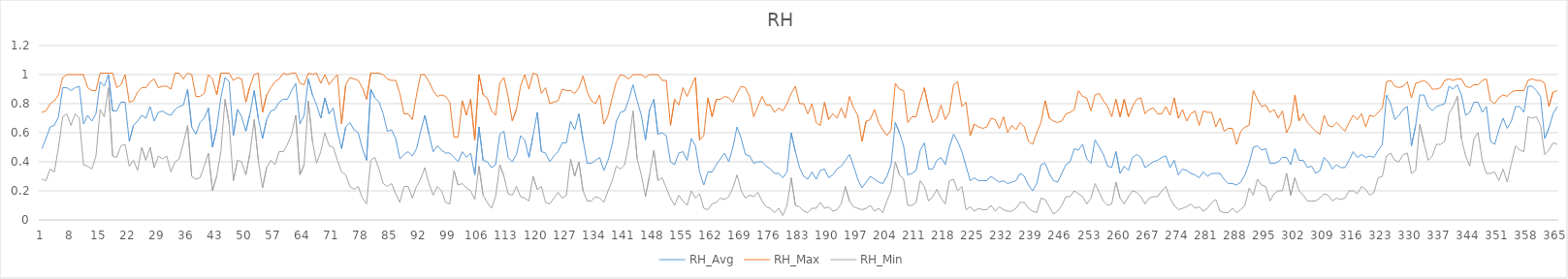
| Category | RH_Avg | RH_Max | RH_Min |
|---|---|---|---|
| 0 | 0.49 | 0.74 | 0.28 |
| 1 | 0.56 | 0.75 | 0.27 |
| 2 | 0.64 | 0.8 | 0.35 |
| 3 | 0.65 | 0.82 | 0.33 |
| 4 | 0.71 | 0.86 | 0.5 |
| 5 | 0.91 | 0.98 | 0.71 |
| 6 | 0.91 | 1 | 0.73 |
| 7 | 0.89 | 1 | 0.65 |
| 8 | 0.91 | 1 | 0.73 |
| 9 | 0.92 | 1 | 0.7 |
| 10 | 0.66 | 1 | 0.38 |
| 11 | 0.72 | 0.91 | 0.37 |
| 12 | 0.68 | 0.89 | 0.35 |
| 13 | 0.73 | 0.89 | 0.44 |
| 14 | 0.95 | 1.01 | 0.76 |
| 15 | 0.92 | 1.01 | 0.71 |
| 16 | 1 | 1.01 | 0.91 |
| 17 | 0.75 | 1.01 | 0.44 |
| 18 | 0.75 | 0.91 | 0.43 |
| 19 | 0.81 | 0.93 | 0.51 |
| 20 | 0.81 | 1 | 0.52 |
| 21 | 0.54 | 0.81 | 0.37 |
| 22 | 0.65 | 0.82 | 0.41 |
| 23 | 0.68 | 0.88 | 0.34 |
| 24 | 0.72 | 0.91 | 0.5 |
| 25 | 0.7 | 0.91 | 0.41 |
| 26 | 0.78 | 0.95 | 0.5 |
| 27 | 0.68 | 0.97 | 0.36 |
| 28 | 0.74 | 0.91 | 0.44 |
| 29 | 0.75 | 0.92 | 0.42 |
| 30 | 0.73 | 0.92 | 0.44 |
| 31 | 0.72 | 0.9 | 0.33 |
| 32 | 0.76 | 1.01 | 0.4 |
| 33 | 0.78 | 1.01 | 0.42 |
| 34 | 0.79 | 0.97 | 0.53 |
| 35 | 0.9 | 1.01 | 0.65 |
| 36 | 0.64 | 1 | 0.3 |
| 37 | 0.59 | 0.85 | 0.28 |
| 38 | 0.67 | 0.85 | 0.29 |
| 39 | 0.7 | 0.87 | 0.37 |
| 40 | 0.77 | 1 | 0.46 |
| 41 | 0.5 | 0.97 | 0.2 |
| 42 | 0.63 | 0.86 | 0.3 |
| 43 | 0.84 | 1.01 | 0.47 |
| 44 | 0.98 | 1.01 | 0.83 |
| 45 | 0.95 | 1.01 | 0.66 |
| 46 | 0.58 | 0.96 | 0.27 |
| 47 | 0.76 | 0.98 | 0.41 |
| 48 | 0.71 | 0.97 | 0.4 |
| 49 | 0.61 | 0.81 | 0.31 |
| 50 | 0.73 | 0.92 | 0.46 |
| 51 | 0.89 | 1 | 0.69 |
| 52 | 0.7 | 1.01 | 0.41 |
| 53 | 0.56 | 0.74 | 0.22 |
| 54 | 0.69 | 0.86 | 0.36 |
| 55 | 0.75 | 0.91 | 0.41 |
| 56 | 0.76 | 0.95 | 0.38 |
| 57 | 0.81 | 0.97 | 0.47 |
| 58 | 0.83 | 1.01 | 0.47 |
| 59 | 0.83 | 1 | 0.52 |
| 60 | 0.89 | 1.01 | 0.59 |
| 61 | 0.94 | 1.01 | 0.72 |
| 62 | 0.66 | 0.94 | 0.31 |
| 63 | 0.72 | 0.93 | 0.38 |
| 64 | 0.97 | 1.01 | 0.82 |
| 65 | 0.86 | 1 | 0.54 |
| 66 | 0.79 | 1.01 | 0.39 |
| 67 | 0.7 | 0.94 | 0.47 |
| 68 | 0.84 | 1 | 0.6 |
| 69 | 0.73 | 0.93 | 0.51 |
| 70 | 0.77 | 0.97 | 0.5 |
| 71 | 0.61 | 1 | 0.41 |
| 72 | 0.49 | 0.66 | 0.33 |
| 73 | 0.64 | 0.93 | 0.31 |
| 74 | 0.67 | 0.98 | 0.23 |
| 75 | 0.62 | 0.97 | 0.21 |
| 76 | 0.6 | 0.96 | 0.23 |
| 77 | 0.49 | 0.91 | 0.15 |
| 78 | 0.41 | 0.83 | 0.11 |
| 79 | 0.9 | 1.01 | 0.41 |
| 80 | 0.84 | 1.01 | 0.43 |
| 81 | 0.81 | 1.01 | 0.35 |
| 82 | 0.73 | 1 | 0.25 |
| 83 | 0.61 | 0.97 | 0.23 |
| 84 | 0.62 | 0.96 | 0.25 |
| 85 | 0.56 | 0.96 | 0.18 |
| 86 | 0.42 | 0.87 | 0.12 |
| 87 | 0.45 | 0.73 | 0.23 |
| 88 | 0.47 | 0.73 | 0.23 |
| 89 | 0.44 | 0.69 | 0.15 |
| 90 | 0.49 | 0.86 | 0.23 |
| 91 | 0.61 | 1 | 0.28 |
| 92 | 0.72 | 1 | 0.36 |
| 93 | 0.59 | 0.95 | 0.25 |
| 94 | 0.47 | 0.89 | 0.17 |
| 95 | 0.51 | 0.85 | 0.23 |
| 96 | 0.48 | 0.86 | 0.2 |
| 97 | 0.46 | 0.85 | 0.12 |
| 98 | 0.46 | 0.81 | 0.11 |
| 99 | 0.43 | 0.57 | 0.34 |
| 100 | 0.4 | 0.57 | 0.24 |
| 101 | 0.47 | 0.82 | 0.25 |
| 102 | 0.43 | 0.72 | 0.22 |
| 103 | 0.46 | 0.83 | 0.2 |
| 104 | 0.31 | 0.55 | 0.14 |
| 105 | 0.64 | 1 | 0.37 |
| 106 | 0.41 | 0.86 | 0.17 |
| 107 | 0.4 | 0.84 | 0.12 |
| 108 | 0.36 | 0.75 | 0.08 |
| 109 | 0.38 | 0.72 | 0.16 |
| 110 | 0.59 | 0.94 | 0.38 |
| 111 | 0.61 | 0.98 | 0.3 |
| 112 | 0.43 | 0.85 | 0.18 |
| 113 | 0.4 | 0.68 | 0.17 |
| 114 | 0.45 | 0.76 | 0.23 |
| 115 | 0.58 | 0.92 | 0.16 |
| 116 | 0.55 | 1 | 0.15 |
| 117 | 0.43 | 0.9 | 0.13 |
| 118 | 0.58 | 1.01 | 0.3 |
| 119 | 0.74 | 1 | 0.21 |
| 120 | 0.47 | 0.87 | 0.23 |
| 121 | 0.46 | 0.91 | 0.12 |
| 122 | 0.4 | 0.8 | 0.11 |
| 123 | 0.44 | 0.81 | 0.15 |
| 124 | 0.47 | 0.82 | 0.19 |
| 125 | 0.53 | 0.9 | 0.15 |
| 126 | 0.53 | 0.89 | 0.17 |
| 127 | 0.68 | 0.89 | 0.42 |
| 128 | 0.62 | 0.87 | 0.3 |
| 129 | 0.73 | 0.91 | 0.4 |
| 130 | 0.55 | 0.99 | 0.2 |
| 131 | 0.39 | 0.88 | 0.13 |
| 132 | 0.39 | 0.82 | 0.13 |
| 133 | 0.41 | 0.8 | 0.16 |
| 134 | 0.43 | 0.86 | 0.15 |
| 135 | 0.34 | 0.66 | 0.12 |
| 136 | 0.41 | 0.72 | 0.2 |
| 137 | 0.52 | 0.84 | 0.27 |
| 138 | 0.68 | 0.95 | 0.37 |
| 139 | 0.74 | 1 | 0.35 |
| 140 | 0.75 | 0.99 | 0.38 |
| 141 | 0.83 | 0.97 | 0.53 |
| 142 | 0.93 | 1 | 0.75 |
| 143 | 0.82 | 1 | 0.42 |
| 144 | 0.72 | 1 | 0.31 |
| 145 | 0.55 | 0.98 | 0.16 |
| 146 | 0.76 | 1 | 0.31 |
| 147 | 0.83 | 1 | 0.48 |
| 148 | 0.59 | 1 | 0.27 |
| 149 | 0.6 | 0.96 | 0.29 |
| 150 | 0.58 | 0.96 | 0.22 |
| 151 | 0.4 | 0.65 | 0.15 |
| 152 | 0.38 | 0.83 | 0.1 |
| 153 | 0.46 | 0.79 | 0.17 |
| 154 | 0.47 | 0.91 | 0.13 |
| 155 | 0.41 | 0.85 | 0.1 |
| 156 | 0.56 | 0.92 | 0.2 |
| 157 | 0.51 | 0.98 | 0.15 |
| 158 | 0.33 | 0.55 | 0.18 |
| 159 | 0.24 | 0.58 | 0.08 |
| 160 | 0.33 | 0.84 | 0.07 |
| 161 | 0.33 | 0.71 | 0.11 |
| 162 | 0.38 | 0.83 | 0.12 |
| 163 | 0.42 | 0.83 | 0.15 |
| 164 | 0.46 | 0.85 | 0.14 |
| 165 | 0.4 | 0.84 | 0.16 |
| 166 | 0.5 | 0.81 | 0.22 |
| 167 | 0.64 | 0.87 | 0.31 |
| 168 | 0.56 | 0.92 | 0.2 |
| 169 | 0.45 | 0.91 | 0.15 |
| 170 | 0.44 | 0.85 | 0.17 |
| 171 | 0.39 | 0.71 | 0.16 |
| 172 | 0.4 | 0.78 | 0.19 |
| 173 | 0.4 | 0.85 | 0.13 |
| 174 | 0.37 | 0.79 | 0.09 |
| 175 | 0.35 | 0.79 | 0.08 |
| 176 | 0.32 | 0.74 | 0.05 |
| 177 | 0.32 | 0.77 | 0.08 |
| 178 | 0.29 | 0.75 | 0.03 |
| 179 | 0.33 | 0.8 | 0.1 |
| 180 | 0.6 | 0.87 | 0.29 |
| 181 | 0.47 | 0.92 | 0.1 |
| 182 | 0.36 | 0.8 | 0.09 |
| 183 | 0.3 | 0.8 | 0.06 |
| 184 | 0.28 | 0.73 | 0.05 |
| 185 | 0.33 | 0.8 | 0.08 |
| 186 | 0.28 | 0.67 | 0.08 |
| 187 | 0.34 | 0.65 | 0.12 |
| 188 | 0.35 | 0.81 | 0.08 |
| 189 | 0.29 | 0.69 | 0.09 |
| 190 | 0.31 | 0.73 | 0.06 |
| 191 | 0.35 | 0.7 | 0.07 |
| 192 | 0.37 | 0.77 | 0.11 |
| 193 | 0.41 | 0.7 | 0.23 |
| 194 | 0.45 | 0.85 | 0.13 |
| 195 | 0.37 | 0.77 | 0.09 |
| 196 | 0.28 | 0.72 | 0.08 |
| 197 | 0.22 | 0.54 | 0.07 |
| 198 | 0.26 | 0.68 | 0.08 |
| 199 | 0.3 | 0.69 | 0.1 |
| 200 | 0.28 | 0.76 | 0.06 |
| 201 | 0.26 | 0.67 | 0.08 |
| 202 | 0.25 | 0.62 | 0.05 |
| 203 | 0.3 | 0.58 | 0.13 |
| 204 | 0.38 | 0.62 | 0.2 |
| 205 | 0.67 | 0.94 | 0.4 |
| 206 | 0.6 | 0.9 | 0.31 |
| 207 | 0.51 | 0.89 | 0.28 |
| 208 | 0.31 | 0.67 | 0.1 |
| 209 | 0.32 | 0.71 | 0.1 |
| 210 | 0.34 | 0.71 | 0.12 |
| 211 | 0.48 | 0.82 | 0.27 |
| 212 | 0.53 | 0.91 | 0.23 |
| 213 | 0.35 | 0.77 | 0.13 |
| 214 | 0.35 | 0.67 | 0.16 |
| 215 | 0.41 | 0.7 | 0.21 |
| 216 | 0.43 | 0.79 | 0.15 |
| 217 | 0.38 | 0.69 | 0.11 |
| 218 | 0.5 | 0.74 | 0.27 |
| 219 | 0.59 | 0.93 | 0.28 |
| 220 | 0.54 | 0.95 | 0.2 |
| 221 | 0.47 | 0.78 | 0.23 |
| 222 | 0.37 | 0.81 | 0.07 |
| 223 | 0.27 | 0.58 | 0.09 |
| 224 | 0.29 | 0.66 | 0.06 |
| 225 | 0.27 | 0.64 | 0.08 |
| 226 | 0.27 | 0.63 | 0.07 |
| 227 | 0.27 | 0.64 | 0.07 |
| 228 | 0.3 | 0.7 | 0.1 |
| 229 | 0.28 | 0.69 | 0.06 |
| 230 | 0.26 | 0.63 | 0.09 |
| 231 | 0.27 | 0.71 | 0.07 |
| 232 | 0.25 | 0.6 | 0.06 |
| 233 | 0.26 | 0.65 | 0.06 |
| 234 | 0.27 | 0.62 | 0.08 |
| 235 | 0.32 | 0.67 | 0.12 |
| 236 | 0.3 | 0.64 | 0.12 |
| 237 | 0.24 | 0.54 | 0.08 |
| 238 | 0.2 | 0.52 | 0.06 |
| 239 | 0.25 | 0.6 | 0.05 |
| 240 | 0.38 | 0.67 | 0.15 |
| 241 | 0.39 | 0.82 | 0.14 |
| 242 | 0.32 | 0.7 | 0.09 |
| 243 | 0.27 | 0.68 | 0.04 |
| 244 | 0.26 | 0.67 | 0.06 |
| 245 | 0.32 | 0.68 | 0.1 |
| 246 | 0.38 | 0.73 | 0.16 |
| 247 | 0.4 | 0.74 | 0.16 |
| 248 | 0.49 | 0.76 | 0.2 |
| 249 | 0.48 | 0.89 | 0.18 |
| 250 | 0.52 | 0.85 | 0.16 |
| 251 | 0.42 | 0.84 | 0.11 |
| 252 | 0.39 | 0.75 | 0.15 |
| 253 | 0.55 | 0.86 | 0.25 |
| 254 | 0.5 | 0.87 | 0.19 |
| 255 | 0.45 | 0.82 | 0.13 |
| 256 | 0.37 | 0.78 | 0.1 |
| 257 | 0.36 | 0.71 | 0.11 |
| 258 | 0.47 | 0.83 | 0.26 |
| 259 | 0.32 | 0.71 | 0.15 |
| 260 | 0.37 | 0.83 | 0.11 |
| 261 | 0.34 | 0.71 | 0.16 |
| 262 | 0.43 | 0.78 | 0.2 |
| 263 | 0.45 | 0.83 | 0.19 |
| 264 | 0.43 | 0.84 | 0.16 |
| 265 | 0.36 | 0.73 | 0.11 |
| 266 | 0.38 | 0.76 | 0.15 |
| 267 | 0.4 | 0.77 | 0.16 |
| 268 | 0.41 | 0.73 | 0.16 |
| 269 | 0.43 | 0.73 | 0.2 |
| 270 | 0.44 | 0.78 | 0.23 |
| 271 | 0.36 | 0.72 | 0.15 |
| 272 | 0.41 | 0.84 | 0.1 |
| 273 | 0.31 | 0.7 | 0.07 |
| 274 | 0.35 | 0.76 | 0.08 |
| 275 | 0.34 | 0.68 | 0.09 |
| 276 | 0.32 | 0.73 | 0.11 |
| 277 | 0.31 | 0.75 | 0.08 |
| 278 | 0.29 | 0.65 | 0.09 |
| 279 | 0.33 | 0.75 | 0.06 |
| 280 | 0.3 | 0.74 | 0.08 |
| 281 | 0.32 | 0.74 | 0.12 |
| 282 | 0.32 | 0.64 | 0.14 |
| 283 | 0.32 | 0.7 | 0.06 |
| 284 | 0.28 | 0.61 | 0.05 |
| 285 | 0.25 | 0.63 | 0.05 |
| 286 | 0.25 | 0.63 | 0.08 |
| 287 | 0.24 | 0.52 | 0.05 |
| 288 | 0.26 | 0.61 | 0.07 |
| 289 | 0.31 | 0.64 | 0.1 |
| 290 | 0.39 | 0.65 | 0.22 |
| 291 | 0.5 | 0.89 | 0.17 |
| 292 | 0.51 | 0.83 | 0.28 |
| 293 | 0.48 | 0.78 | 0.24 |
| 294 | 0.49 | 0.79 | 0.23 |
| 295 | 0.39 | 0.74 | 0.13 |
| 296 | 0.39 | 0.76 | 0.18 |
| 297 | 0.4 | 0.7 | 0.2 |
| 298 | 0.43 | 0.75 | 0.2 |
| 299 | 0.43 | 0.6 | 0.32 |
| 300 | 0.38 | 0.66 | 0.17 |
| 301 | 0.49 | 0.86 | 0.29 |
| 302 | 0.41 | 0.68 | 0.2 |
| 303 | 0.41 | 0.73 | 0.17 |
| 304 | 0.36 | 0.67 | 0.13 |
| 305 | 0.37 | 0.64 | 0.13 |
| 306 | 0.32 | 0.61 | 0.13 |
| 307 | 0.34 | 0.59 | 0.15 |
| 308 | 0.43 | 0.72 | 0.18 |
| 309 | 0.4 | 0.65 | 0.17 |
| 310 | 0.35 | 0.64 | 0.13 |
| 311 | 0.38 | 0.67 | 0.15 |
| 312 | 0.36 | 0.64 | 0.14 |
| 313 | 0.36 | 0.61 | 0.15 |
| 314 | 0.41 | 0.67 | 0.2 |
| 315 | 0.47 | 0.72 | 0.2 |
| 316 | 0.43 | 0.69 | 0.18 |
| 317 | 0.45 | 0.73 | 0.23 |
| 318 | 0.43 | 0.64 | 0.21 |
| 319 | 0.44 | 0.72 | 0.17 |
| 320 | 0.43 | 0.71 | 0.19 |
| 321 | 0.48 | 0.74 | 0.29 |
| 322 | 0.52 | 0.77 | 0.3 |
| 323 | 0.86 | 0.95 | 0.44 |
| 324 | 0.8 | 0.96 | 0.46 |
| 325 | 0.69 | 0.92 | 0.41 |
| 326 | 0.72 | 0.91 | 0.4 |
| 327 | 0.76 | 0.92 | 0.45 |
| 328 | 0.78 | 0.95 | 0.46 |
| 329 | 0.51 | 0.84 | 0.32 |
| 330 | 0.65 | 0.94 | 0.34 |
| 331 | 0.86 | 0.95 | 0.66 |
| 332 | 0.86 | 0.96 | 0.53 |
| 333 | 0.78 | 0.94 | 0.41 |
| 334 | 0.75 | 0.9 | 0.44 |
| 335 | 0.78 | 0.9 | 0.52 |
| 336 | 0.79 | 0.91 | 0.52 |
| 337 | 0.8 | 0.96 | 0.54 |
| 338 | 0.92 | 0.97 | 0.73 |
| 339 | 0.9 | 0.96 | 0.78 |
| 340 | 0.93 | 0.97 | 0.85 |
| 341 | 0.86 | 0.97 | 0.56 |
| 342 | 0.72 | 0.92 | 0.44 |
| 343 | 0.74 | 0.91 | 0.37 |
| 344 | 0.81 | 0.93 | 0.56 |
| 345 | 0.81 | 0.93 | 0.6 |
| 346 | 0.74 | 0.96 | 0.41 |
| 347 | 0.78 | 0.97 | 0.32 |
| 348 | 0.54 | 0.82 | 0.32 |
| 349 | 0.52 | 0.8 | 0.33 |
| 350 | 0.62 | 0.84 | 0.27 |
| 351 | 0.7 | 0.86 | 0.35 |
| 352 | 0.63 | 0.85 | 0.26 |
| 353 | 0.68 | 0.88 | 0.39 |
| 354 | 0.78 | 0.89 | 0.51 |
| 355 | 0.78 | 0.89 | 0.48 |
| 356 | 0.74 | 0.89 | 0.47 |
| 357 | 0.92 | 0.96 | 0.71 |
| 358 | 0.92 | 0.97 | 0.7 |
| 359 | 0.89 | 0.96 | 0.71 |
| 360 | 0.85 | 0.96 | 0.65 |
| 361 | 0.56 | 0.94 | 0.45 |
| 362 | 0.63 | 0.78 | 0.48 |
| 363 | 0.73 | 0.88 | 0.53 |
| 364 | 0.78 | 0.89 | 0.52 |